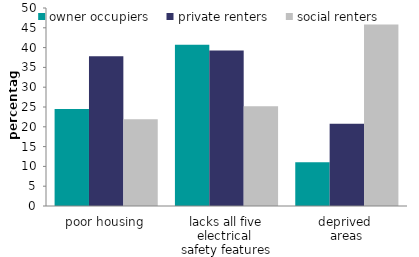
| Category | owner occupiers | private renters | social renters |
|---|---|---|---|
| poor housing | 24.499 | 37.838 | 21.907 |
| lacks all five electrical 
safety features | 40.708 | 39.253 | 25.177 |
| deprived 
areas | 11.057 | 20.777 | 45.859 |